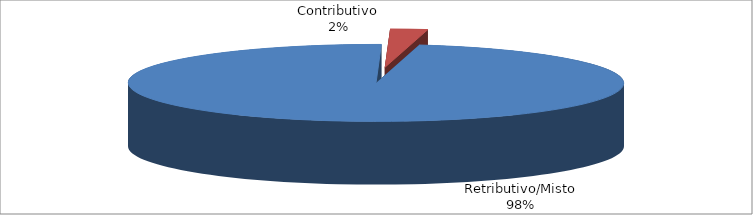
| Category | Decorrenti gennaio - marzo 2020 |
|---|---|
| Retributivo/Misto | 9619 |
| Contributivo | 240 |